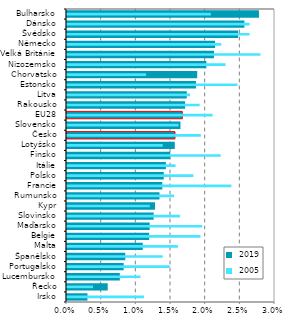
| Category |  2019 |
|---|---|
| Irsko | 0.003 |
| Řecko | 0.006 |
| Lucembursko | 0.008 |
| Portugalsko | 0.008 |
| Španělsko | 0.009 |
| Malta | 0.011 |
| Belgie | 0.012 |
| Maďarsko | 0.012 |
| Slovinsko | 0.013 |
| Kypr | 0.013 |
| Rumunsko | 0.013 |
| Francie | 0.014 |
| Polsko | 0.014 |
| Itálie | 0.014 |
| Finsko | 0.015 |
| Lotyšsko | 0.016 |
| Česko | 0.016 |
| Slovensko | 0.017 |
| EU28 | 0.017 |
| Rakousko | 0.017 |
| Litva | 0.017 |
| Estonsko | 0.019 |
| Chorvatsko | 0.019 |
| Nizozemsko | 0.02 |
| Velká Británie | 0.021 |
| Německo | 0.022 |
| Švédsko | 0.025 |
| Dánsko | 0.026 |
| Bulharsko | 0.028 |